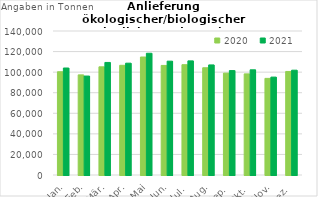
| Category | 2020 | 2021 |
|---|---|---|
| Jan. | 100386.304 | 104022.436 |
| Feb. | 97336.193 | 96192.822 |
| Mär. | 105169.957 | 109431.566 |
| Apr. | 106654.42 | 108719.196 |
| Mai | 114708.222 | 118361.199 |
| Jun. | 106515.106 | 110673.901 |
| Jul. | 107250.237 | 110946.308 |
| Aug. | 104258.551 | 107006.009 |
| Sep. | 99053.88 | 101523.321 |
| Okt. | 98313.065 | 102276.226 |
| Nov. | 93931.557 | 95176.078 |
| Dez. | 100660.199 | 101890.025 |